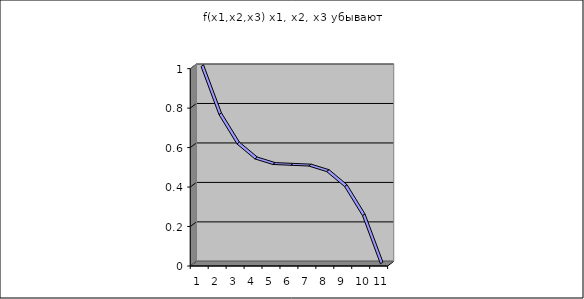
| Category | f(x1,x2,x3) x1, x2, x3 убывают |
|---|---|
| 0 | 1 |
| 1 | 0.756 |
| 2 | 0.608 |
| 3 | 0.532 |
| 4 | 0.504 |
| 5 | 0.5 |
| 6 | 0.496 |
| 7 | 0.468 |
| 8 | 0.392 |
| 9 | 0.244 |
| 10 | 0 |